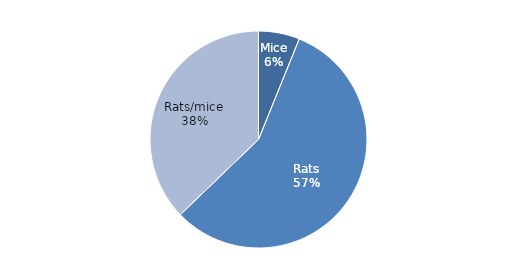
| Category | Series 0 |
|---|---|
| Mice | 6.125 |
| Rats | 56.684 |
| Rats/mice | 37.19 |